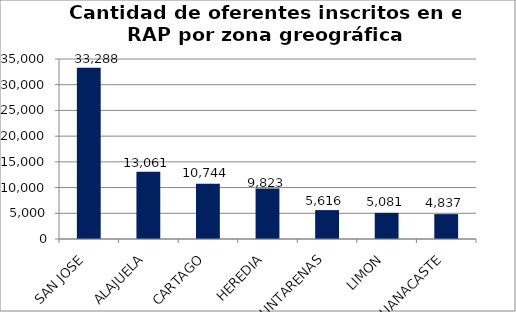
| Category | Cantidad |
|---|---|
| SAN JOSE | 33288 |
| ALAJUELA | 13061 |
| CARTAGO | 10744 |
| HEREDIA | 9823 |
| PUNTARENAS | 5616 |
| LIMON | 5081 |
| GUANACASTE | 4837 |